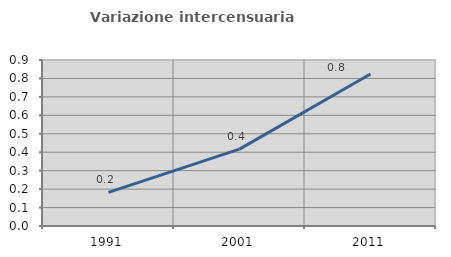
| Category | Variazione intercensuaria annua |
|---|---|
| 1991.0 | 0.183 |
| 2001.0 | 0.417 |
| 2011.0 | 0.824 |